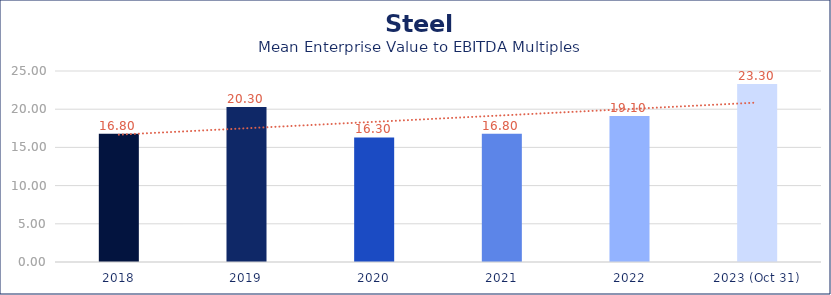
| Category | Steel |
|---|---|
| 2018 | 16.8 |
| 2019 | 20.3 |
| 2020 | 16.3 |
| 2021 | 16.8 |
| 2022 | 19.1 |
| 2023 (Oct 31) | 23.3 |